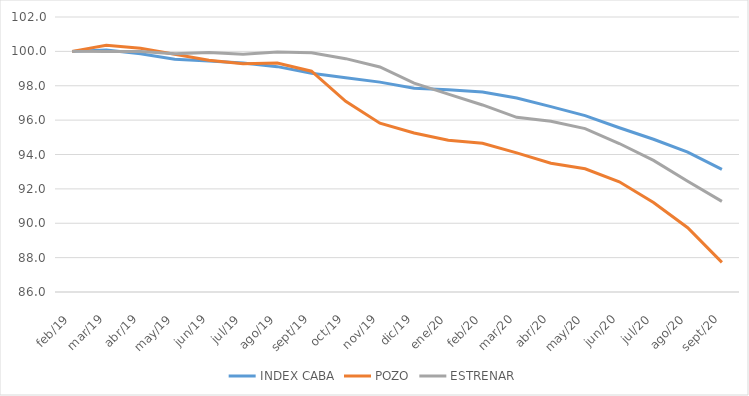
| Category | INDEX CABA | POZO | ESTRENAR |
|---|---|---|---|
| Feb-19 | 100 | 100 | 100 |
| Mar-19 | 100.076 | 100.352 | 99.992 |
| Apr-19 | 99.867 | 100.187 | 99.99 |
| May-19 | 99.543 | 99.832 | 99.856 |
| Jun-19 | 99.443 | 99.486 | 99.937 |
| Jul-19 | 99.327 | 99.275 | 99.826 |
| Aug-19 | 99.112 | 99.326 | 99.962 |
| Sep-19 | 98.725 | 98.846 | 99.925 |
| Oct-19 | 98.469 | 97.094 | 99.577 |
| Nov-19 | 98.211 | 95.821 | 99.091 |
| Dec-19 | 97.857 | 95.249 | 98.153 |
| Jan-20 | 97.769 | 94.833 | 97.514 |
| Feb-20 | 97.637 | 94.654 | 96.882 |
| Mar-20 | 97.292 | 94.093 | 96.162 |
| Apr-20 | 96.787 | 93.493 | 95.937 |
| May-20 | 96.263 | 93.167 | 95.509 |
| Jun-20 | 95.558 | 92.411 | 94.639 |
| Jul-20 | 94.889 | 91.21 | 93.656 |
| Aug-20 | 94.142 | 89.739 | 92.442 |
| Sep-20 | 93.133 | 87.722 | 91.272 |